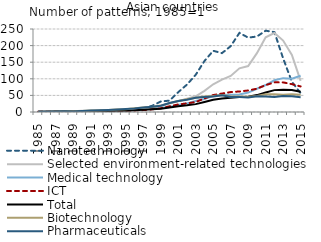
| Category | Nanotechnology | Selected environment-related technologies | Medical technology | ICT | Total | Biotechnology | Pharmaceuticals |
|---|---|---|---|---|---|---|---|
| 1985.0 | 1 | 1 | 1 | 1 | 1 | 1 | 1 |
| 1986.0 | 1.444 | 1.205 | 1.426 | 0.992 | 1.021 | 1.069 | 1.096 |
| 1987.0 | 0.333 | 1.719 | 2.394 | 1.23 | 1.417 | 1.781 | 1.529 |
| 1988.0 | 2 | 2.655 | 3.188 | 1.878 | 1.792 | 2.346 | 2.006 |
| 1989.0 | 1.333 | 2.313 | 2.967 | 1.779 | 1.879 | 2.603 | 1.691 |
| 1990.0 | 2.833 | 3.723 | 2.633 | 2.187 | 2.37 | 3.249 | 3.023 |
| 1991.0 | 1.313 | 2.598 | 2.326 | 2.139 | 2.479 | 4.678 | 4.759 |
| 1992.0 | 2.833 | 3.692 | 3.192 | 2.09 | 2.608 | 4.959 | 5.474 |
| 1993.0 | 2.73 | 4.295 | 3.602 | 2.046 | 2.917 | 5.84 | 6.329 |
| 1994.0 | 1.722 | 5.325 | 3.474 | 2.46 | 3.492 | 7.579 | 7.697 |
| 1995.0 | 4.567 | 5.417 | 5.242 | 3.073 | 4.127 | 8.43 | 9.137 |
| 1996.0 | 8.456 | 7.995 | 6.37 | 4.735 | 5.406 | 11.499 | 10.489 |
| 1997.0 | 11.246 | 9.567 | 8.132 | 5.719 | 6.63 | 13.255 | 13.356 |
| 1998.0 | 18.583 | 11.961 | 9.518 | 8.036 | 8.184 | 15.139 | 16.151 |
| 1999.0 | 31.638 | 17.305 | 12.059 | 11.05 | 10.026 | 19.307 | 18.823 |
| 2000.0 | 34.323 | 25.473 | 15.234 | 17.136 | 13.76 | 26.711 | 26.946 |
| 2001.0 | 59.684 | 32.614 | 21.09 | 22.711 | 17.395 | 33.237 | 33.345 |
| 2002.0 | 82.573 | 39.95 | 26.042 | 25.934 | 20.042 | 38.603 | 37.048 |
| 2003.0 | 112.159 | 47.196 | 33.166 | 30.071 | 23.734 | 43.215 | 42.62 |
| 2004.0 | 153.563 | 63.85 | 39.117 | 40.667 | 30.364 | 46.686 | 44.925 |
| 2005.0 | 184.418 | 83.395 | 48.786 | 51.017 | 36.589 | 47.867 | 46.791 |
| 2006.0 | 177.311 | 97.396 | 50.953 | 55.559 | 40.405 | 51.063 | 50.059 |
| 2007.0 | 198.276 | 108.699 | 51.932 | 60.018 | 42.976 | 46.387 | 45.163 |
| 2008.0 | 238.323 | 131.443 | 53.057 | 61.845 | 45.388 | 47.004 | 45.535 |
| 2009.0 | 224.052 | 138.382 | 58.419 | 64.855 | 46.148 | 45.598 | 44.01 |
| 2010.0 | 227.343 | 177.259 | 70.146 | 70.214 | 50.947 | 48.505 | 47.64 |
| 2011.0 | 244.913 | 225.168 | 81.254 | 80.975 | 58.95 | 53.515 | 46.538 |
| 2012.0 | 240.766 | 237.957 | 95.622 | 89.304 | 65.887 | 53.408 | 44.996 |
| 2013.0 | 161.474 | 215.242 | 101.963 | 89.186 | 66.955 | 52.05 | 48.237 |
| 2014.0 | 90.939 | 171.954 | 100.253 | 83.882 | 66.465 | 53.77 | 47.199 |
| 2015.0 | 56.667 | 93.91 | 109.355 | 77.011 | 60.934 | 51.98 | 44.29 |